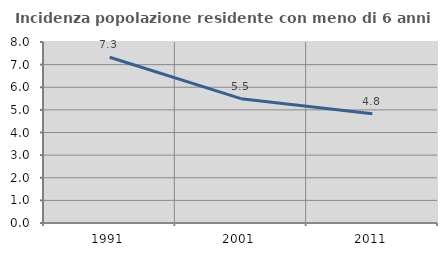
| Category | Incidenza popolazione residente con meno di 6 anni |
|---|---|
| 1991.0 | 7.325 |
| 2001.0 | 5.495 |
| 2011.0 | 4.831 |